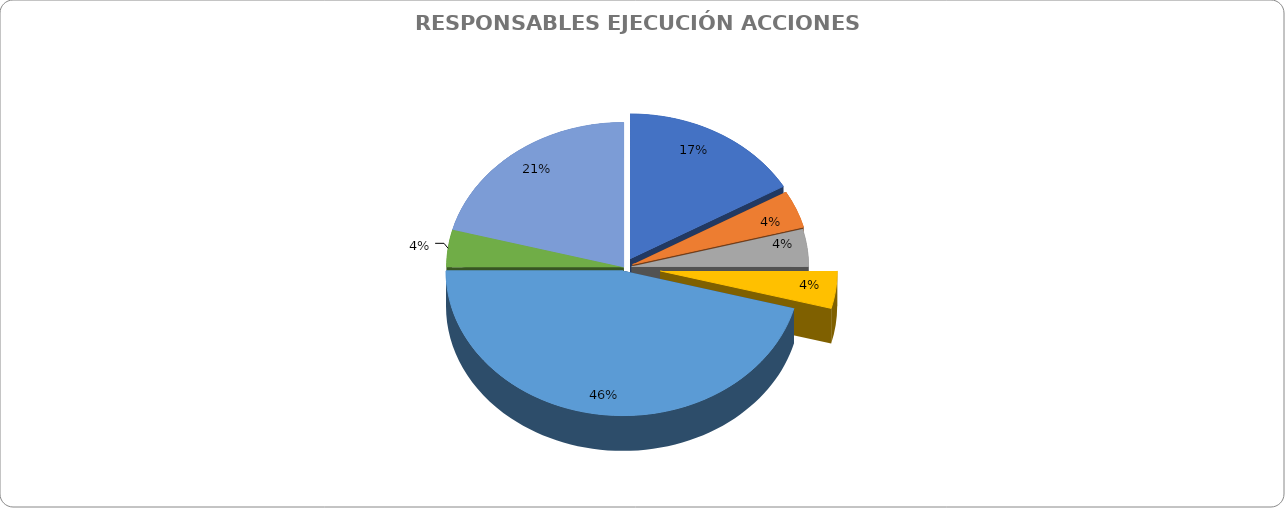
| Category | Cuenta de ESTADO DE LA ACCION |
|---|---|
| SUBDIRECCIÓN FINANCIERA | 4 |
| SUBDIRECCIÓN DE SEÑALIZACIÓN / DIRECCIÓN DE TALENTO HUMANO | 1 |
| SUBDIRECCION DE CONTROL DE TRANSITO TRANSPORTE | 1 |
| Subdirección de Contravenciones | 1 |
| Subdirección Administrativa | 11 |
| OFICINA DE TECNOLOGÍAS DE LA INFORMACIÓN Y LAS COMUNICACIONES / Subdirección Administrativa | 1 |
| OFICINA DE TECNOLOGÍAS DE LA INFORMACIÓN Y LAS COMUNICACIONES | 5 |